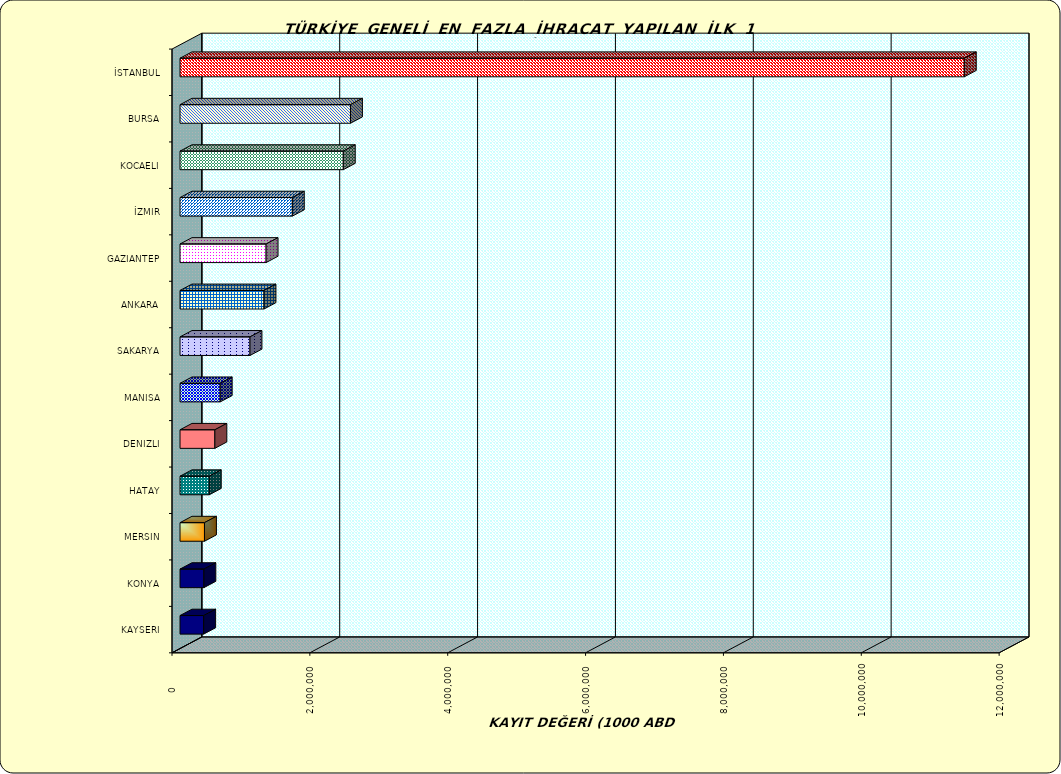
| Category | Series 0 |
|---|---|
| İSTANBUL | 11378077.702 |
| BURSA | 2472840.955 |
| KOCAELI | 2368518.343 |
| İZMIR | 1629287.581 |
| GAZIANTEP | 1248693.428 |
| ANKARA | 1218114.583 |
| SAKARYA | 1015041.193 |
| MANISA | 582669.4 |
| DENIZLI | 505416.181 |
| HATAY | 424100.424 |
| MERSIN | 354682.752 |
| KONYA | 345860.992 |
| KAYSERI | 343086.237 |